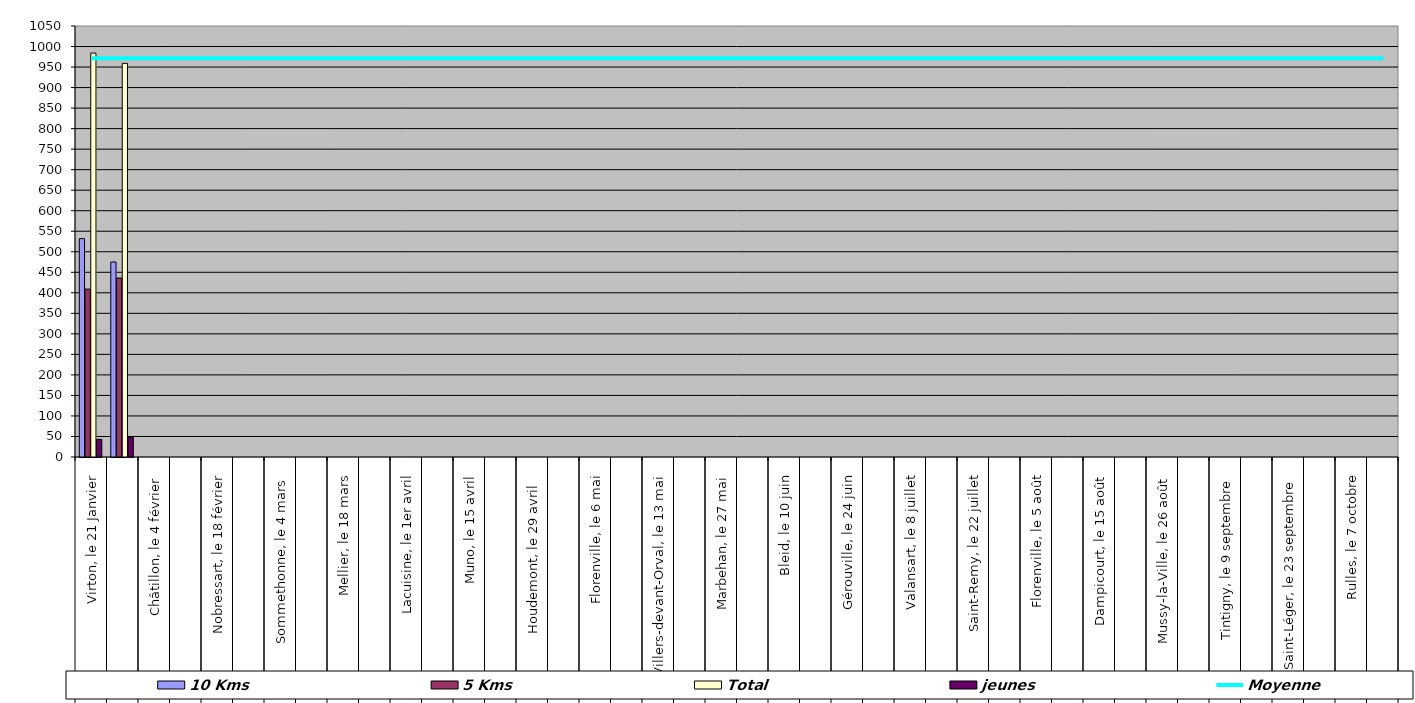
| Category | 10 Kms | 5 Kms | Total | jeunes |
|---|---|---|---|---|
| 0 | 532 | 409 | 984 | 43 |
| 1 | 475 | 436 | 959 | 48 |
| 2 | 0 | 0 | 0 | 0 |
| 3 | 0 | 0 | 0 | 0 |
| 4 | 0 | 0 | 0 | 0 |
| 5 | 0 | 0 | 0 | 0 |
| 6 | 0 | 0 | 0 | 0 |
| 7 | 0 | 0 | 0 | 0 |
| 8 | 0 | 0 | 0 | 0 |
| 9 | 0 | 0 | 0 | 0 |
| 10 | 0 | 0 | 0 | 0 |
| 11 | 0 | 0 | 0 | 0 |
| 12 | 0 | 0 | 0 | 0 |
| 13 | 0 | 0 | 0 | 0 |
| 14 | 0 | 0 | 0 | 0 |
| 15 | 0 | 0 | 0 | 0 |
| 16 | 0 | 0 | 0 | 0 |
| 17 | 0 | 0 | 0 | 0 |
| 18 | 0 | 0 | 0 | 0 |
| 19 | 0 | 0 | 0 | 0 |
| 20 | 0 | 0 | 0 | 0 |
| 21 | 0 | 0 | 0 | 0 |
| 22 | 0 | 0 | 0 | 0 |
| 23 | 0 | 0 | 0 | 0 |
| 24 | 0 | 0 | 0 | 0 |
| 25 | 0 | 0 | 0 | 0 |
| 26 | 0 | 0 | 0 | 0 |
| 27 | 0 | 0 | 0 | 0 |
| 28 | 0 | 0 | 0 | 0 |
| 29 | 0 | 0 | 0 | 0 |
| 30 | 0 | 0 | 0 | 0 |
| 31 | 0 | 0 | 0 | 0 |
| 32 | 0 | 0 | 0 | 0 |
| 33 | 0 | 0 | 0 | 0 |
| 34 | 0 | 0 | 0 | 0 |
| 35 | 0 | 0 | 0 | 0 |
| 36 | 0 | 0 | 0 | 0 |
| 37 | 0 | 0 | 0 | 0 |
| 38 | 0 | 0 | 0 | 0 |
| 39 | 0 | 0 | 0 | 0 |
| 40 | 0 | 0 | 0 | 0 |
| 41 | 0 | 0 | 0 | 0 |